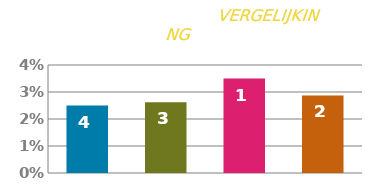
| Category | TARIEF |
|---|---|
| 0 | 0.025 |
| 1 | 0.026 |
| 2 | 0.035 |
| 3 | 0.029 |